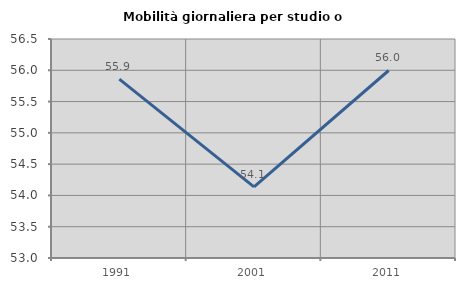
| Category | Mobilità giornaliera per studio o lavoro |
|---|---|
| 1991.0 | 55.859 |
| 2001.0 | 54.136 |
| 2011.0 | 55.997 |